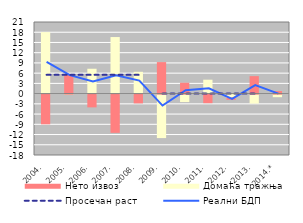
| Category | Домаћа тражњa | Нето извоз |
|---|---|---|
| 2004. | 18.04 | -8.709 |
| 2005. | -0.053 | 5.456 |
| 2006. | 7.294 | -3.737 |
| 2007. | 16.59 | -11.208 |
| 2008. | 6.397 | -2.578 |
| 2009. | -12.744 | 9.238 |
| 2010. | -2.183 | 3.19 |
| 2011. | 4.081 | -2.514 |
| 2012. | -1.125 | -0.397 |
| 2013. | -2.626 | 5.124 |
| 2014.* | -0.755 | 0.754 |